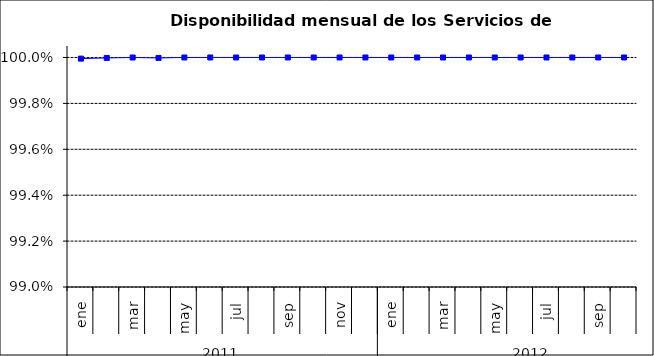
| Category | SCL |
|---|---|
| 0 | 1 |
| 1 | 1 |
| 2 | 1 |
| 3 | 1 |
| 4 | 1 |
| 5 | 1 |
| 6 | 1 |
| 7 | 1 |
| 8 | 1 |
| 9 | 1 |
| 10 | 1 |
| 11 | 1 |
| 12 | 1 |
| 13 | 1 |
| 14 | 1 |
| 15 | 1 |
| 16 | 1 |
| 17 | 1 |
| 18 | 1 |
| 19 | 1 |
| 20 | 1 |
| 21 | 1 |